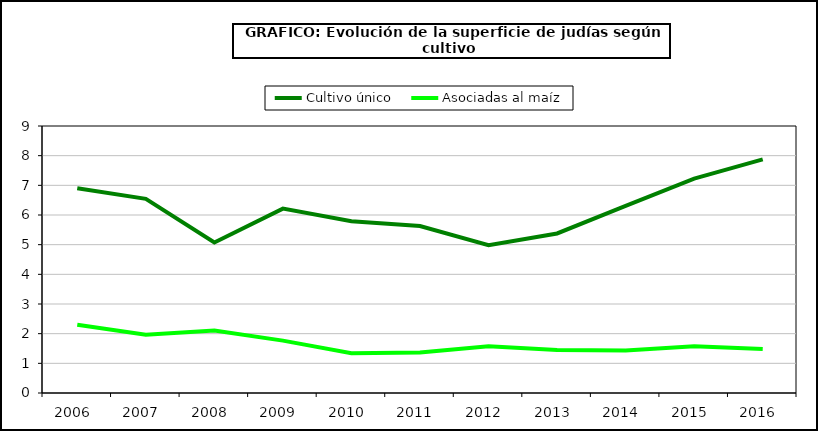
| Category | Cultivo único | Asociadas al maíz |
|---|---|---|
| 2006.0 | 6.905 | 2.301 |
| 2007.0 | 6.544 | 1.963 |
| 2008.0 | 5.075 | 2.105 |
| 2009.0 | 6.216 | 1.766 |
| 2010.0 | 5.792 | 1.338 |
| 2011.0 | 5.626 | 1.363 |
| 2012.0 | 4.982 | 1.572 |
| 2013.0 | 5.378 | 1.451 |
| 2014.0 | 6.305 | 1.432 |
| 2015.0 | 7.227 | 1.575 |
| 2016.0 | 7.876 | 1.479 |